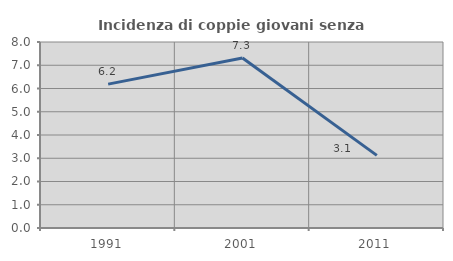
| Category | Incidenza di coppie giovani senza figli |
|---|---|
| 1991.0 | 6.189 |
| 2001.0 | 7.309 |
| 2011.0 | 3.125 |